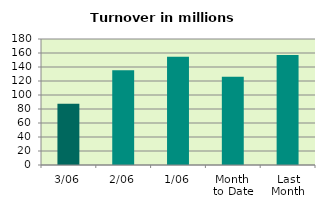
| Category | Series 0 |
|---|---|
| 3/06 | 87.539 |
| 2/06 | 135.433 |
| 1/06 | 154.8 |
| Month 
to Date | 125.924 |
| Last
Month | 157.265 |